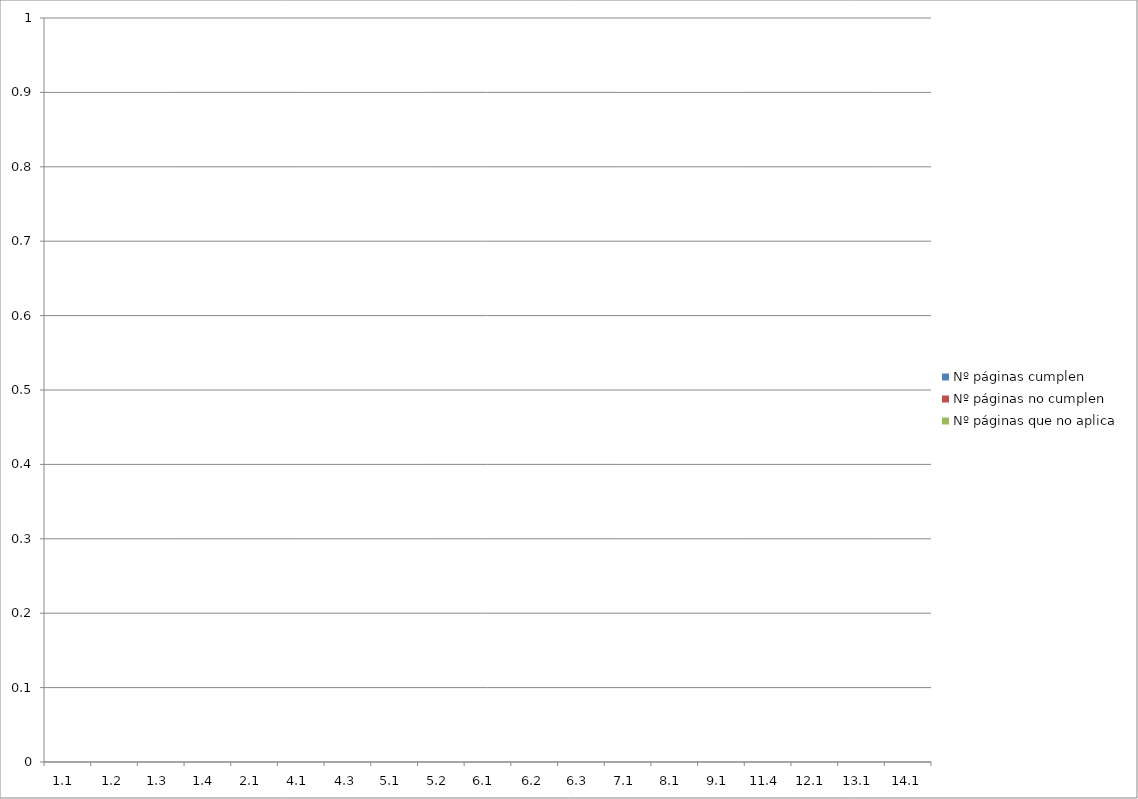
| Category | Nº páginas cumplen | Nº páginas no cumplen | Nº páginas que no aplica |
|---|---|---|---|
| 1.1  | 0 | 0 | 0 |
| 1.2 | 0 | 0 | 0 |
| 1.3  | 0 | 0 | 0 |
| 1.4  | 0 | 0 | 0 |
| 2.1  | 0 | 0 | 0 |
| 4.1  | 0 | 0 | 0 |
| 4.3 | 0 | 0 | 0 |
| 5.1  | 0 | 0 | 0 |
| 5.2  | 0 | 0 | 0 |
| 6.1  | 0 | 0 | 0 |
| 6.2 | 0 | 0 | 0 |
| 6.3  | 0 | 0 | 0 |
| 7.1  | 0 | 0 | 0 |
| 8.1  | 0 | 0 | 0 |
| 9.1  | 0 | 0 | 0 |
| 11.4  | 0 | 0 | 0 |
| 12.1  | 0 | 0 | 0 |
| 13.1  | 0 | 0 | 0 |
| 14.1 | 0 | 0 | 0 |